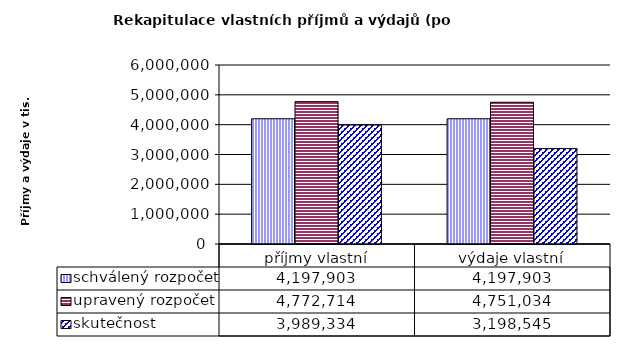
| Category | schválený rozpočet | upravený rozpočet | skutečnost |
|---|---|---|---|
| příjmy vlastní | 4197903 | 4772714 | 3989334 |
| výdaje vlastní | 4197903 | 4751034 | 3198545 |